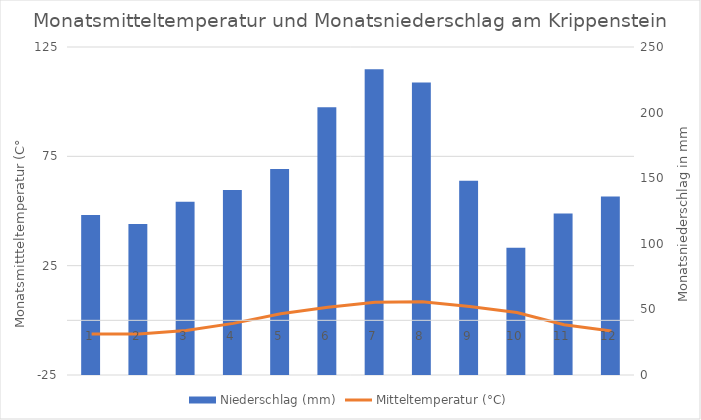
| Category | Niederschlag (mm) |
|---|---|
| 0 | 122 |
| 1 | 115 |
| 2 | 132 |
| 3 | 141 |
| 4 | 157 |
| 5 | 204 |
| 6 | 233 |
| 7 | 223 |
| 8 | 148 |
| 9 | 97 |
| 10 | 123 |
| 11 | 136 |